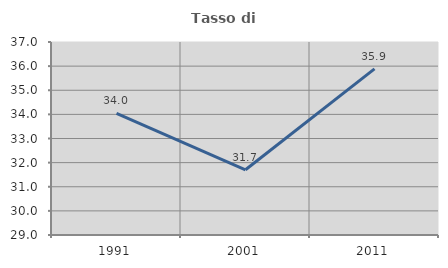
| Category | Tasso di occupazione   |
|---|---|
| 1991.0 | 34.043 |
| 2001.0 | 31.704 |
| 2011.0 | 35.889 |